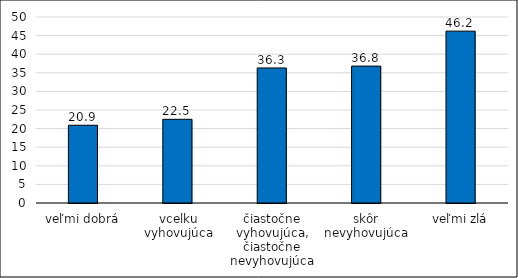
| Category | Rad 1 |
|---|---|
| veľmi dobrá | 20.9 |
| vcelku vyhovujúca | 22.5 |
| čiastočne vyhovujúca, čiastočne nevyhovujúca | 36.3 |
| skôr nevyhovujúca | 36.8 |
| veľmi zlá | 46.2 |